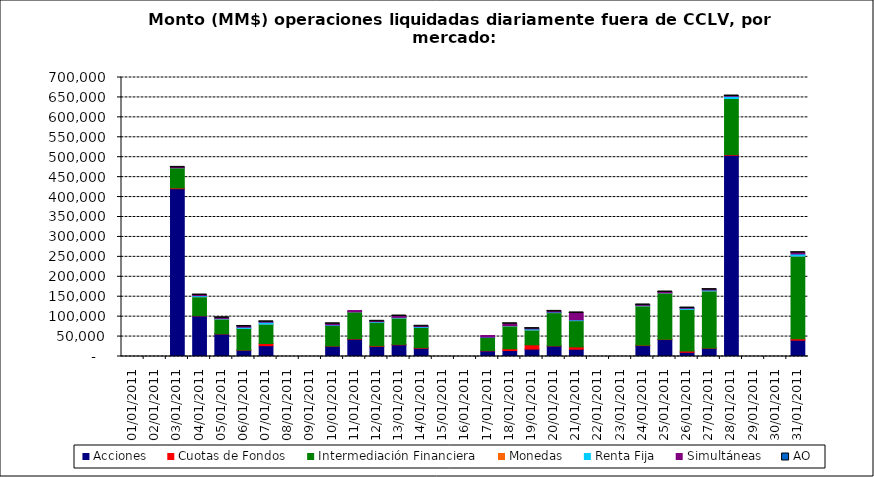
| Category | Acciones | Cuotas de Fondos | Intermediación Financiera | Monedas | Renta Fija | Simultáneas | AO |
|---|---|---|---|---|---|---|---|
| 03/01/2011 | 420983.758 | 1917.671 | 50534.927 | 3.01 | 295.419 | 741.722 | 0.108 |
| 04/01/2011 | 101982.021 | 432.442 | 47395.267 | 0.87 | 2787.378 | 1642.93 | 0.351 |
| 05/01/2011 | 56613.573 | 312.012 | 37077.499 | 12.673 | 1547.244 | 1429.671 | 0.387 |
| 06/01/2011 | 15829.986 | 423.402 | 54164.201 | 2.641 | 3092.912 | 1819.294 | 1.301 |
| 07/01/2011 | 27224.523 | 5448.271 | 48343.552 | 18.48 | 5007.138 | 925.204 | 0.238 |
| 10/01/2011 | 25878.786 | 532.027 | 51285.816 | 2.2 | 1570.495 | 2769.909 | 1.42 |
| 11/01/2011 | 43666.147 | 1004.189 | 67274.207 | 12.748 | 172.531 | 3160.534 | 0 |
| 12/01/2011 | 25316.669 | 1427.165 | 58925.368 | 17.297 | 1859.302 | 706.843 | 0.299 |
| 13/01/2011 | 29347.494 | 1015.71 | 66072.663 | 5.694 | 1766.364 | 3321.577 | 0.205 |
| 14/01/2011 | 20652.578 | 1402.454 | 50834.713 | 13.14 | 2097.543 | 828.901 | 0.624 |
| 17/01/2011 | 14133.357 | 764.868 | 32838.035 | 1.314 | 750.678 | 4236.628 | 0 |
| 18/01/2011 | 14935.255 | 4510.077 | 57067.565 | 7.97 | 1073.563 | 4529.206 | 0.079 |
| 19/01/2011 | 18542.238 | 10714.423 | 37113.226 | 0.89 | 2878.047 | 695.122 | 0.36 |
| 20/01/2011 | 26403.081 | 591.417 | 83067.327 | 9.035 | 1506.515 | 1582.422 | 0.05 |
| 21/01/2011 | 18274.966 | 5810.78 | 65802.028 | 7.503 | 2053.743 | 17348.505 | 0.06 |
| 24/01/2011 | 27406.377 | 1013.922 | 98499.111 | 4.131 | 1377.999 | 993.929 | 0.059 |
| 25/01/2011 | 42490.335 | 767.412 | 116120.816 | 2.325 | 546.018 | 1870.396 | 0.02 |
| 26/01/2011 | 10522.44 | 3154.924 | 104546.028 | 13.15 | 2797.59 | 517.871 | 0.01 |
| 27/01/2011 | 20671.593 | 553.236 | 143065.733 | 7.602 | 2447.413 | 1008.619 | 2.194 |
| 28/01/2011 | 504971.142 | 1588.594 | 140797.57 | 13.475 | 5492.412 | 666.525 | 0.424 |
| 31/01/2011 | 40939.67 | 3767.111 | 207158.445 | 8.73 | 5365.728 | 3220.448 | 0.418 |